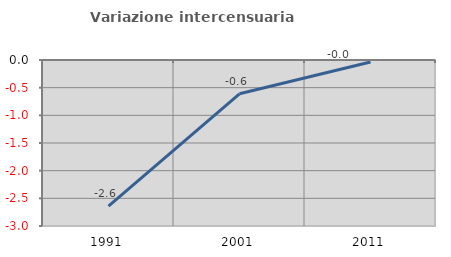
| Category | Variazione intercensuaria annua |
|---|---|
| 1991.0 | -2.641 |
| 2001.0 | -0.611 |
| 2011.0 | -0.035 |